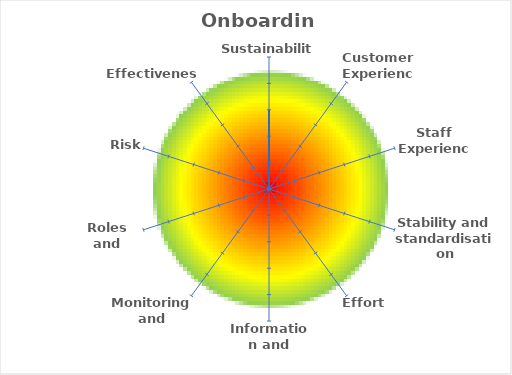
| Category | Onboarding |
|---|---|
| Sustainability | 3 |
| Customer Experience | 0 |
| Staff Experience | 0 |
| Stability and standardisation | 0 |
| Effort | 0 |
| Information and records | 0 |
| Monitoring and oversight | 0 |
| Roles and resources | 0 |
| Risk | 0 |
| Effectiveness | 0 |